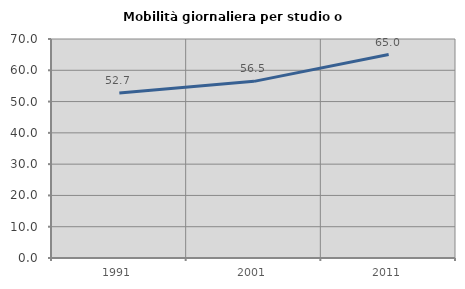
| Category | Mobilità giornaliera per studio o lavoro |
|---|---|
| 1991.0 | 52.709 |
| 2001.0 | 56.459 |
| 2011.0 | 65.022 |